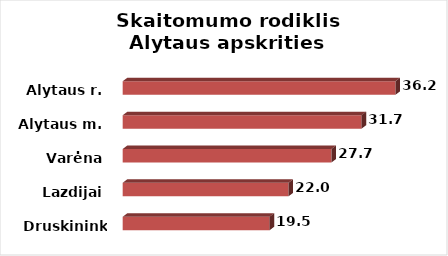
| Category | Series 0 |
|---|---|
| Druskininkai | 19.5 |
| Lazdijai | 22 |
| Varėna | 27.7 |
| Alytaus m. | 31.7 |
| Alytaus r. | 36.2 |